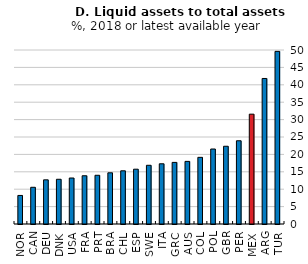
| Category | Series 0 |
|---|---|
| NOR | 8.207 |
| CAN | 10.548 |
| DEU | 12.69 |
| DNK | 12.854 |
| USA | 13.215 |
| FRA | 13.863 |
| PRT | 14.003 |
| BRA | 14.711 |
| CHL | 15.288 |
| ESP | 15.75 |
| SWE | 16.869 |
| ITA | 17.303 |
| GRC | 17.703 |
| AUS | 17.992 |
| COL | 19.151 |
| POL | 21.551 |
| GBR | 22.342 |
| PER | 23.918 |
| MEX | 31.56 |
| ARG | 41.815 |
| TUR | 49.608 |